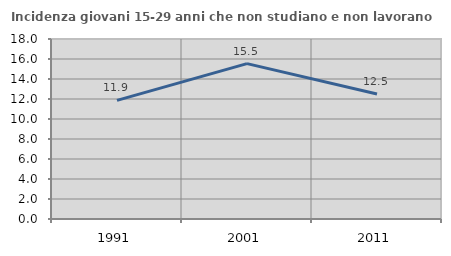
| Category | Incidenza giovani 15-29 anni che non studiano e non lavorano  |
|---|---|
| 1991.0 | 11.86 |
| 2001.0 | 15.534 |
| 2011.0 | 12.5 |